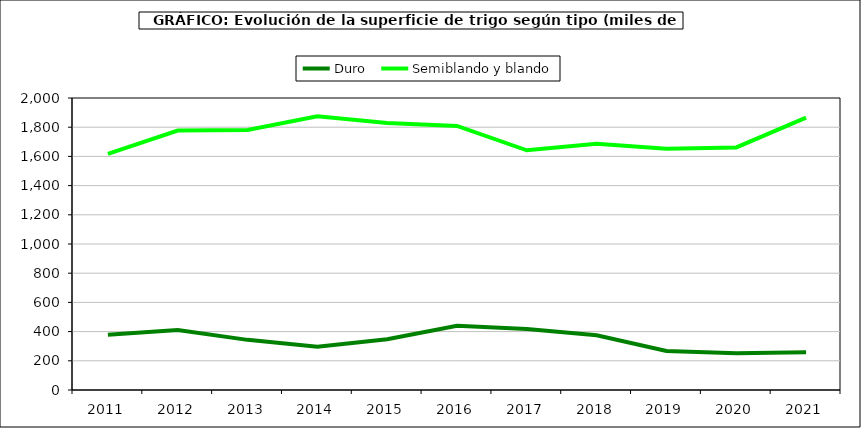
| Category | Duro | Semiblando y blando |
|---|---|---|
| 2011 | 378.054 | 1616.599 |
| 2012 | 411.053 | 1777.118 |
| 2013 | 343.389 | 1781.58 |
| 2014 | 297.13 | 1874.542 |
| 2015 | 347.93 | 1828.423 |
| 2016 | 440.16 | 1808.688 |
| 2017 | 417.589 | 1641.635 |
| 2018 | 374.608 | 1686.9 |
| 2019 | 266.644 | 1651.762 |
| 2020 | 250.903 | 1661.696 |
| 2021 | 259.057 | 1865.801 |